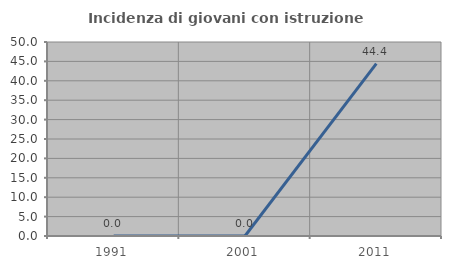
| Category | Incidenza di giovani con istruzione universitaria |
|---|---|
| 1991.0 | 0 |
| 2001.0 | 0 |
| 2011.0 | 44.444 |